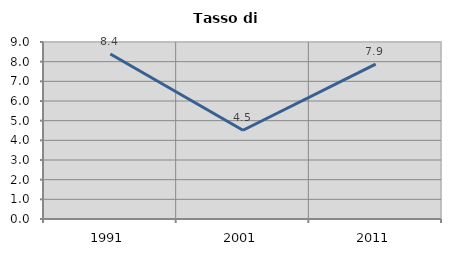
| Category | Tasso di disoccupazione   |
|---|---|
| 1991.0 | 8.392 |
| 2001.0 | 4.511 |
| 2011.0 | 7.87 |